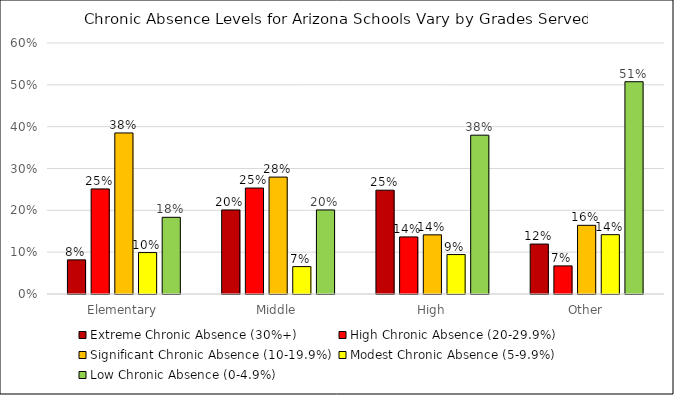
| Category | Extreme Chronic Absence (30%+) | High Chronic Absence (20-29.9%) | Significant Chronic Absence (10-19.9%) | Modest Chronic Absence (5-9.9%) | Low Chronic Absence (0-4.9%) |
|---|---|---|---|---|---|
| Elementary | 0.082 | 0.251 | 0.385 | 0.099 | 0.183 |
| Middle | 0.201 | 0.253 | 0.279 | 0.066 | 0.201 |
| High | 0.248 | 0.136 | 0.141 | 0.094 | 0.38 |
| Other | 0.119 | 0.067 | 0.164 | 0.142 | 0.507 |